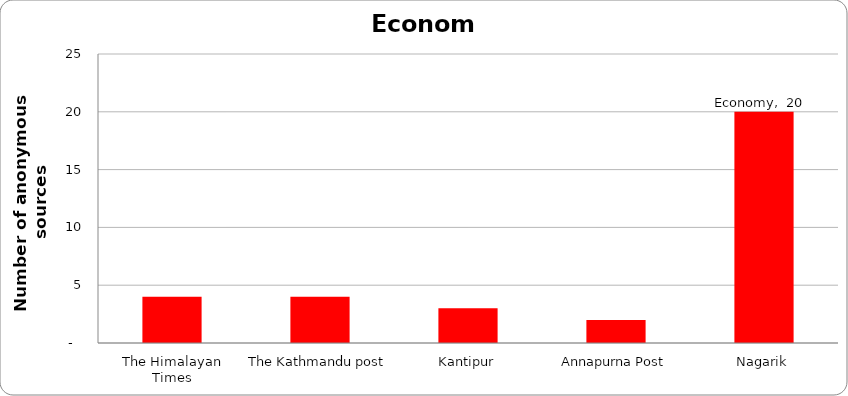
| Category | Economy |
|---|---|
| The Himalayan Times | 4 |
| The Kathmandu post | 4 |
| Kantipur | 3 |
| Annapurna Post | 2 |
| Nagarik | 20 |